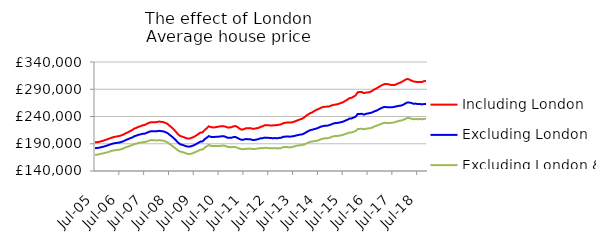
| Category | Including London | Excluding London | Excluding London & SE |
|---|---|---|---|
| 2005-07-01 | 192637.159 | 181907.72 | 169795.831 |
| 2005-08-01 | 192884.354 | 182204.23 | 169987.184 |
| 2005-09-01 | 193456.443 | 182742.056 | 170702.858 |
| 2005-10-01 | 194586.143 | 183737.129 | 171701.029 |
| 2005-11-01 | 195531.81 | 184532.419 | 172389.265 |
| 2005-12-01 | 197150.584 | 185848.339 | 173484.345 |
| 2006-01-01 | 198153.754 | 186784.385 | 174234.386 |
| 2006-02-01 | 199813.466 | 188293.933 | 175667.543 |
| 2006-03-01 | 200983.99 | 189563.153 | 176864.263 |
| 2006-04-01 | 202245.961 | 190631.185 | 177763.943 |
| 2006-05-01 | 203065.042 | 191320.143 | 178237.47 |
| 2006-06-01 | 203685.673 | 191766.348 | 178667.182 |
| 2006-07-01 | 204559.278 | 192518.713 | 179240.302 |
| 2006-08-01 | 205714.078 | 193584.707 | 180374.517 |
| 2006-09-01 | 207431.746 | 195106.329 | 181749.008 |
| 2006-10-01 | 209492.23 | 197111.646 | 183707.283 |
| 2006-11-01 | 211163.513 | 198406.834 | 184803.513 |
| 2006-12-01 | 213373.811 | 200184.26 | 186416.618 |
| 2007-01-01 | 215210.655 | 201535.877 | 187495.779 |
| 2007-02-01 | 217819.553 | 203758.447 | 189382.285 |
| 2007-03-01 | 219232.983 | 204906.873 | 190190.222 |
| 2007-04-01 | 221043.784 | 206461.247 | 191479.848 |
| 2007-05-01 | 222128.218 | 207210.749 | 192197.244 |
| 2007-06-01 | 223865.002 | 208372.622 | 192900.311 |
| 2007-07-01 | 224582.145 | 208580.061 | 193035.973 |
| 2007-08-01 | 226402.251 | 210003.659 | 194051.294 |
| 2007-09-01 | 228182.408 | 211660.89 | 195600.841 |
| 2007-10-01 | 229491.543 | 212979.597 | 196744.628 |
| 2007-11-01 | 229231.088 | 212815.295 | 196339.408 |
| 2007-12-01 | 229404.46 | 212905.332 | 196268.186 |
| 2008-01-01 | 229854.007 | 213027.6 | 195912.124 |
| 2008-02-01 | 230778.597 | 213705.985 | 196694.794 |
| 2008-03-01 | 230153.08 | 213164.837 | 196101.029 |
| 2008-04-01 | 229721.005 | 212737.65 | 195822.963 |
| 2008-05-01 | 228299.829 | 211346.238 | 194168.374 |
| 2008-06-01 | 226513.482 | 209628.718 | 192662.12 |
| 2008-07-01 | 223227.056 | 206570.363 | 189831.839 |
| 2008-08-01 | 220141.088 | 203679.753 | 187225.176 |
| 2008-09-01 | 216463.272 | 200406.398 | 184122.693 |
| 2008-10-01 | 212510.657 | 196770.87 | 181148.64 |
| 2008-11-01 | 207922.628 | 192723.223 | 178029.517 |
| 2008-12-01 | 204675.242 | 189438.674 | 175758.498 |
| 2009-01-01 | 203165.33 | 188120.612 | 174922.017 |
| 2009-02-01 | 201911.844 | 186937.237 | 173762.452 |
| 2009-03-01 | 200225.813 | 185488.87 | 172349.467 |
| 2009-04-01 | 199383.576 | 184697.341 | 171110.985 |
| 2009-05-01 | 199859.253 | 184756.733 | 171205.109 |
| 2009-06-01 | 201412.925 | 186174.835 | 172334.989 |
| 2009-07-01 | 203027.61 | 187480.446 | 173713.12 |
| 2009-08-01 | 205323.71 | 189670.327 | 175544.14 |
| 2009-09-01 | 208069.093 | 191780.428 | 177250.424 |
| 2009-10-01 | 210492.42 | 194114.663 | 179195.013 |
| 2009-11-01 | 210907.6 | 194343.802 | 179474.947 |
| 2009-12-01 | 215086.622 | 198299.021 | 182879.128 |
| 2010-01-01 | 218354.797 | 201001.848 | 185163.534 |
| 2010-02-01 | 222015.55 | 204057.089 | 187708.694 |
| 2010-03-01 | 220623.663 | 202645.504 | 186217.211 |
| 2010-04-01 | 219905.901 | 202176.286 | 185722.593 |
| 2010-05-01 | 220113.626 | 202560.477 | 185660.627 |
| 2010-06-01 | 220921.717 | 202881.827 | 185810.225 |
| 2010-07-01 | 221564.916 | 203122.974 | 185746.775 |
| 2010-08-01 | 222318.029 | 203658.874 | 186337.462 |
| 2010-09-01 | 222269.425 | 203857.033 | 186786.545 |
| 2010-10-01 | 221434.684 | 202970.552 | 186021.486 |
| 2010-11-01 | 219854.924 | 201144.854 | 184354.861 |
| 2010-12-01 | 219866.03 | 200772.354 | 183953.951 |
| 2011-01-01 | 220405.999 | 201085.753 | 183724.506 |
| 2011-02-01 | 222145.885 | 202302.374 | 184279.405 |
| 2011-03-01 | 222431.145 | 202224.902 | 183521.52 |
| 2011-04-01 | 220277.333 | 200405.646 | 182499.86 |
| 2011-05-01 | 217364.071 | 198328.18 | 180845.101 |
| 2011-06-01 | 215781.529 | 197203.528 | 180025.16 |
| 2011-07-01 | 216886.961 | 197679.846 | 180204.195 |
| 2011-08-01 | 218462.386 | 198609.764 | 180911.764 |
| 2011-09-01 | 218447.96 | 198336.118 | 180896.336 |
| 2011-10-01 | 218746.451 | 198390.032 | 181179.074 |
| 2011-11-01 | 217505.539 | 197130.138 | 180183.324 |
| 2011-12-01 | 217590.911 | 196985.648 | 180310.287 |
| 2012-01-01 | 218300.924 | 197626.217 | 180700.792 |
| 2012-02-01 | 219064.04 | 198509.293 | 181516.234 |
| 2012-03-01 | 220982.893 | 200008.532 | 182063.76 |
| 2012-04-01 | 221888.073 | 200155.168 | 181813.842 |
| 2012-05-01 | 224080.255 | 201265.513 | 182442.614 |
| 2012-06-01 | 224094.767 | 201103.147 | 182450.163 |
| 2012-07-01 | 223904.739 | 200785.472 | 181887.565 |
| 2012-08-01 | 223391.425 | 200470.454 | 181782.505 |
| 2012-09-01 | 223676.621 | 200097.203 | 181530.42 |
| 2012-10-01 | 224076.65 | 200441.649 | 182155.422 |
| 2012-11-01 | 224222.02 | 199942.059 | 181394.869 |
| 2012-12-01 | 224932.069 | 200752.198 | 181819.304 |
| 2013-01-01 | 225725.691 | 200982.997 | 181992.077 |
| 2013-02-01 | 227657.684 | 202887.461 | 183982.638 |
| 2013-03-01 | 228536.318 | 203048.201 | 183714.128 |
| 2013-04-01 | 229161.736 | 203446.577 | 184041.738 |
| 2013-05-01 | 228933.746 | 202978.692 | 183179.668 |
| 2013-06-01 | 229215.618 | 203313.988 | 184002.652 |
| 2013-07-01 | 230067.874 | 204001.956 | 184567.567 |
| 2013-08-01 | 231582.352 | 204974.592 | 185829.063 |
| 2013-09-01 | 233071.269 | 205820.443 | 186816.952 |
| 2013-10-01 | 234544.706 | 206712.595 | 187392.956 |
| 2013-11-01 | 235649.654 | 207108.713 | 187518.32 |
| 2013-12-01 | 237829.132 | 208690.471 | 188380.852 |
| 2014-01-01 | 241172.518 | 210845.071 | 190258.481 |
| 2014-02-01 | 243555.901 | 212961.021 | 191924.926 |
| 2014-03-01 | 246091.044 | 214920.699 | 193529.609 |
| 2014-04-01 | 247497.872 | 215742.692 | 194071.52 |
| 2014-05-01 | 250020.497 | 216873.39 | 194767.88 |
| 2014-06-01 | 252131.969 | 217799.223 | 195254.109 |
| 2014-07-01 | 253728.94 | 219290.342 | 196257.739 |
| 2014-08-01 | 255600.623 | 221085.588 | 198018.95 |
| 2014-09-01 | 257111.229 | 222135.43 | 199079.718 |
| 2014-10-01 | 258073.581 | 223029.625 | 200160.045 |
| 2014-11-01 | 258087.083 | 223011.964 | 199843.07 |
| 2014-12-01 | 258355.146 | 223877.078 | 200718.802 |
| 2015-01-01 | 259818.582 | 225210.893 | 201785.11 |
| 2015-02-01 | 261058.597 | 226814.296 | 203490.572 |
| 2015-03-01 | 261701.1 | 227767.121 | 204141.593 |
| 2015-04-01 | 262401.663 | 228109.591 | 204365.531 |
| 2015-05-01 | 263522.572 | 228848.656 | 204714.335 |
| 2015-06-01 | 265038.057 | 229662.855 | 205471.122 |
| 2015-07-01 | 266149.558 | 230709.975 | 206333.662 |
| 2015-08-01 | 268751.273 | 232422.039 | 208026.359 |
| 2015-09-01 | 270772.804 | 233951.289 | 209022.454 |
| 2015-10-01 | 273642.208 | 236127.485 | 210714.392 |
| 2015-11-01 | 274283.861 | 236389.602 | 210643.36 |
| 2015-12-01 | 276419.926 | 238068.942 | 212021.052 |
| 2016-01-01 | 278666.894 | 239684.952 | 213316.584 |
| 2016-02-01 | 284429.326 | 244573.995 | 217105.031 |
| 2016-03-01 | 284960.108 | 244731.444 | 217261.044 |
| 2016-04-01 | 284944.646 | 244897.165 | 217499.971 |
| 2016-05-01 | 282948.008 | 243398.657 | 216367.949 |
| 2016-06-01 | 283814.098 | 244972.216 | 217645.462 |
| 2016-07-01 | 284190.963 | 245619.864 | 217954.862 |
| 2016-08-01 | 285049.367 | 246455.532 | 218604.261 |
| 2016-09-01 | 286912.583 | 247394.501 | 219476.719 |
| 2016-10-01 | 289670.712 | 249511.292 | 221752.508 |
| 2016-11-01 | 291498.925 | 250634.807 | 222803.879 |
| 2016-12-01 | 293656.422 | 252651.113 | 224419.645 |
| 2017-01-01 | 296045.746 | 254644.227 | 225828.224 |
| 2017-02-01 | 297925.198 | 256460.388 | 227390.828 |
| 2017-03-01 | 299532.967 | 257558.551 | 228486.491 |
| 2017-04-01 | 299423.633 | 257166.082 | 228173.347 |
| 2017-05-01 | 299190.467 | 257160.498 | 228268.798 |
| 2017-06-01 | 297886.132 | 256790.143 | 228164.478 |
| 2017-07-01 | 297602.368 | 257235.793 | 228726.011 |
| 2017-08-01 | 297927.458 | 257981.86 | 229619.226 |
| 2017-09-01 | 299860.906 | 258916.701 | 230833.839 |
| 2017-10-01 | 301424.211 | 259653.346 | 231953.02 |
| 2017-11-01 | 302797.677 | 260050.813 | 232608.205 |
| 2017-12-01 | 304958.069 | 261590.298 | 233803.517 |
| 2018-01-01 | 307408.338 | 263772.47 | 235518.412 |
| 2018-02-01 | 308799.698 | 265855.48 | 237281.302 |
| 2018-03-01 | 307837.128 | 265536.144 | 236915.354 |
| 2018-04-01 | 305699.513 | 264763.253 | 236068.665 |
| 2018-05-01 | 304290.765 | 263276.995 | 234832.018 |
| 2018-06-01 | 303827.722 | 263704.187 | 235464.044 |
| 2018-07-01 | 303103.08 | 262769.742 | 234980.044 |
| 2018-08-01 | 303453.041 | 262980.373 | 235398.789 |
| 2018-09-01 | 303343.494 | 262241.232 | 234902.981 |
| 2018-10-01 | 304789.173 | 262820.133 | 235567.456 |
| 2018-11-01 | 305521.56 | 263104.226 | 235992.974 |